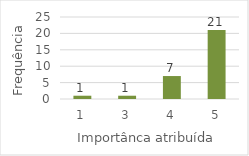
| Category | Series 0 |
|---|---|
| 1.0 | 1 |
| 3.0 | 1 |
| 4.0 | 7 |
| 5.0 | 21 |